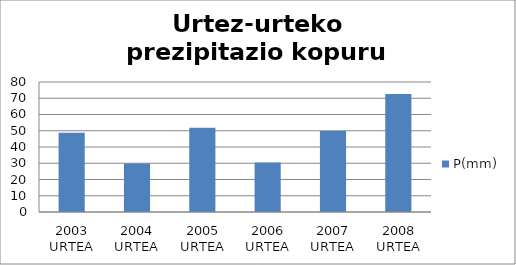
| Category | P(mm) |
|---|---|
| 2003 URTEA | 48.7 |
| 2004 URTEA | 29.9 |
| 2005 URTEA | 51.8 |
| 2006 URTEA | 30.4 |
| 2007 URTEA | 49.9 |
| 2008 URTEA | 72.6 |